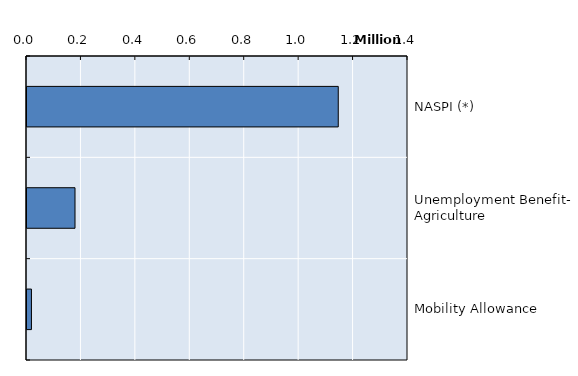
| Category | NASPI (*) |
|---|---|
| NASPI (*) | 1143748 |
| Unemployment Benefit- Agriculture | 176423.31 |
| Mobility Allowance | 16348 |